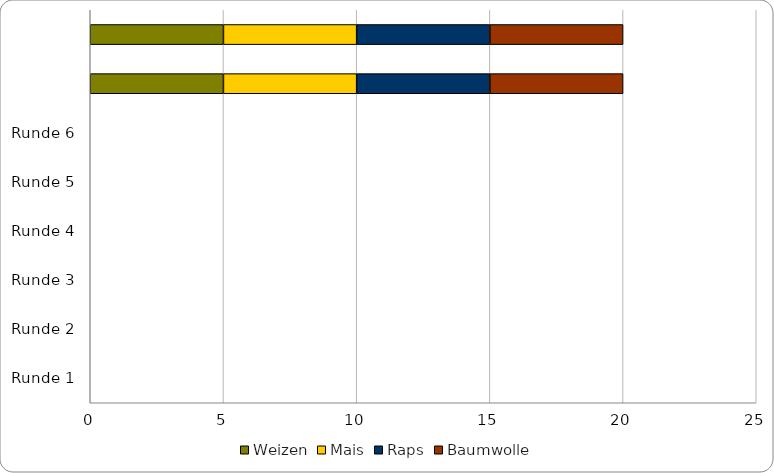
| Category | Weizen | Mais | Raps | Baumwolle |
|---|---|---|---|---|
|  | 5 | 5 | 5 | 5 |
|  | 5 | 5 | 5 | 5 |
| Runde 6 | 0 | 0 | 0 | 0 |
| Runde 5 | 0 | 0 | 0 | 0 |
| Runde 4 | 0 | 0 | 0 | 0 |
| Runde 3 | 0 | 0 | 0 | 0 |
| Runde 2 | 0 | 0 | 0 | 0 |
| Runde 1 | 0 | 0 | 0 | 0 |